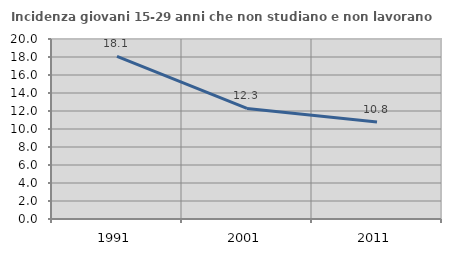
| Category | Incidenza giovani 15-29 anni che non studiano e non lavorano  |
|---|---|
| 1991.0 | 18.072 |
| 2001.0 | 12.281 |
| 2011.0 | 10.769 |